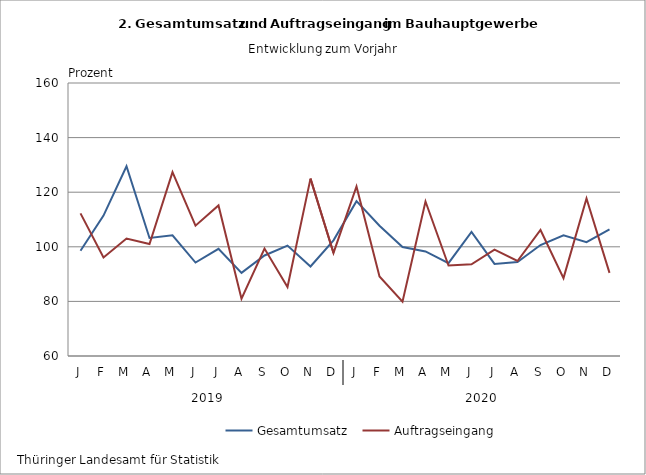
| Category | Gesamtumsatz | Auftragseingang |
|---|---|---|
| J | 98.541 | 112.234 |
| F | 111.419 | 96.066 |
| M | 129.511 | 103.036 |
| A | 103.234 | 101.018 |
| M | 104.216 | 127.324 |
| J | 94.22 | 107.746 |
| J | 99.237 | 115.165 |
| A | 90.444 | 80.975 |
| S | 96.825 | 99.349 |
| O | 100.442 | 85.258 |
| N | 92.792 | 124.96 |
| D | 102.383 | 97.749 |
| J | 116.725 | 122.12 |
| F | 107.715 | 89.154 |
| M | 99.901 | 79.879 |
| A | 98.299 | 116.618 |
| M | 93.996 | 93.128 |
| J | 105.476 | 93.604 |
| J | 93.732 | 98.986 |
| A | 94.426 | 94.802 |
| S | 100.653 | 106.153 |
| O | 104.206 | 88.533 |
| N | 101.695 | 117.678 |
| D | 106.365 | 90.443 |